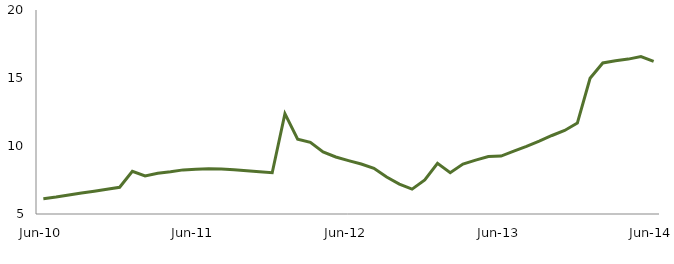
| Category | Series 0 |
|---|---|
| Jun-10 | 6.125 |
|  | 6.247 |
|  | 6.396 |
|  | 6.537 |
|  | 6.676 |
|  | 6.827 |
|  | 6.968 |
|  | 8.137 |
|  | 7.801 |
|  | 7.992 |
|  | 8.099 |
|  | 8.243 |
| Jun-11 | 8.283 |
|  | 8.327 |
|  | 8.304 |
|  | 8.259 |
|  | 8.185 |
|  | 8.108 |
|  | 8.036 |
|  | 12.375 |
|  | 10.497 |
|  | 10.263 |
|  | 9.559 |
|  | 9.193 |
| Jun-12 | 8.922 |
|  | 8.673 |
|  | 8.362 |
|  | 7.718 |
|  | 7.203 |
|  | 6.83 |
|  | 7.501 |
|  | 8.721 |
|  | 8.039 |
|  | 8.674 |
|  | 8.965 |
|  | 9.231 |
| Jun-13 | 9.256 |
|  | 9.619 |
|  | 9.967 |
|  | 10.353 |
|  | 10.773 |
|  | 11.141 |
|  | 11.682 |
|  | 14.982 |
|  | 16.103 |
|  | 16.268 |
|  | 16.389 |
|  | 16.574 |
| Jun-14 | 16.222 |